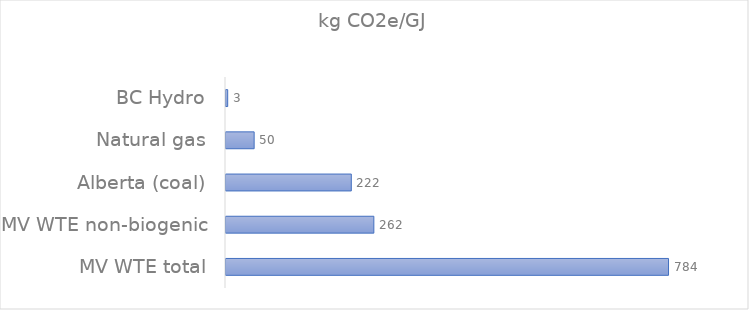
| Category | kg CO2e/GJ |
|---|---|
| MV WTE total | 783.998 |
| MV WTE non-biogenic | 261.95 |
| Alberta (coal) | 222 |
| Natural gas | 49.87 |
| BC Hydro | 3 |